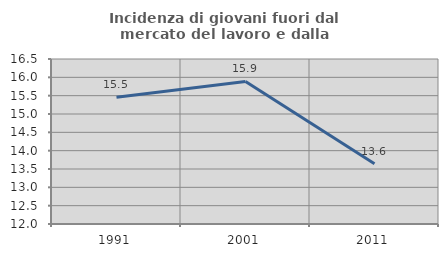
| Category | Incidenza di giovani fuori dal mercato del lavoro e dalla formazione  |
|---|---|
| 1991.0 | 15.457 |
| 2001.0 | 15.888 |
| 2011.0 | 13.642 |